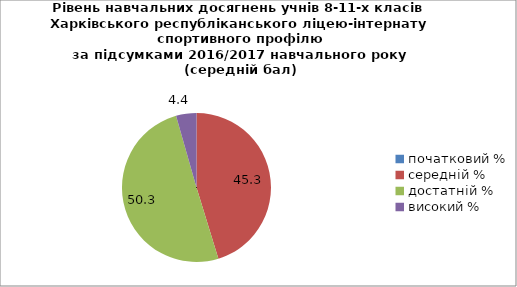
| Category | Кількість учнів за мережею |
|---|---|
| початковий % | 0 |
| середній % | 45.252 |
| достатній % | 50.317 |
| високий % | 4.431 |